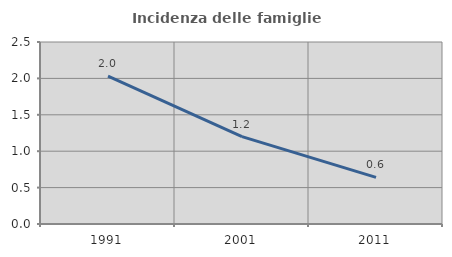
| Category | Incidenza delle famiglie numerose |
|---|---|
| 1991.0 | 2.03 |
| 2001.0 | 1.201 |
| 2011.0 | 0.64 |